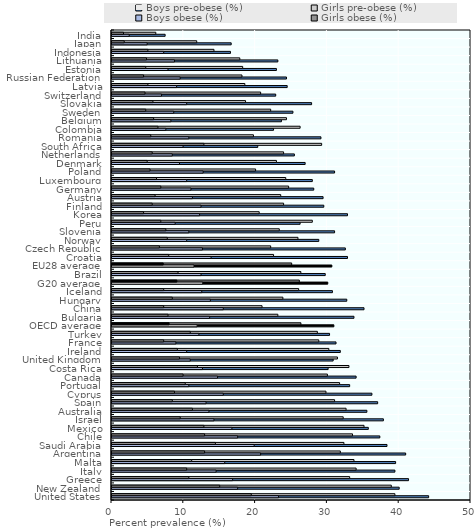
| Category | Boys pre-obese (%) | Girls pre-obese (%) |
|---|---|---|
| United States | 44.1 | 39.4 |
| New Zealand | 40 | 38.9 |
| Greece | 41.3 | 33.1 |
| Italy | 39.4 | 34 |
| Malta | 39.5 | 33.7 |
| Argentina | 40.9 | 31.8 |
| Saudi Arabia | 38.3 | 32.3 |
| Chile | 37.3 | 33.5 |
| Mexico | 35.7 | 35.1 |
| Israel | 37.8 | 32.2 |
| Australia | 35.5 | 32.6 |
| Spain | 37 | 31 |
| Cyprus | 36.2 | 29.8 |
| Portugal | 33.1 | 31.7 |
| Canada | 34 | 30 |
| Costa Rica | 30.1 | 33 |
| United Kingdom | 30.8 | 31.4 |
| Ireland | 31.8 | 30.2 |
| France | 31.2 | 28.8 |
| Turkey | 30.3 | 28.6 |
| OECD average | 30.9 | 26.308 |
| Bulgaria | 33.7 | 23.1 |
| China | 35.1 | 20.9 |
| Hungary | 32.7 | 23.8 |
| Iceland | 30.7 | 26 |
| G20 average | 30.053 | 26.089 |
| Brazil | 29.7 | 26.3 |
| EU28 average | 30.618 | 25.025 |
| Croatia | 32.8 | 22.5 |
| Czech Republic | 32.5 | 22.1 |
| Norway | 28.8 | 25.9 |
| Slovenia | 31 | 23.3 |
| Peru | 26.2 | 27.9 |
| Korea | 32.8 | 20.5 |
| Finland | 29.5 | 23.9 |
| Austria | 29.4 | 23.5 |
| Germany | 28.1 | 24.6 |
| Luxembourg | 27.9 | 24.2 |
| Poland | 31 | 20 |
| Denmark | 26.9 | 22.9 |
| Netherlands | 25.4 | 23.9 |
| South Africa | 20.3 | 29.2 |
| Romania | 29.1 | 19.7 |
| Colombia | 22.5 | 26.2 |
| Belgium | 23.6 | 24.3 |
| Sweden | 25.2 | 22.1 |
| Slovakia | 27.8 | 18.6 |
| Switzerland | 22.8 | 20.7 |
| Latvia | 24.4 | 18.5 |
| Russian Federation | 24.3 | 18.1 |
| Estonia | 22.9 | 18.2 |
| Lithuania | 23.1 | 17.8 |
| Indonesia | 16.5 | 14.2 |
| Japan | 16.6 | 11.8 |
| India | 7.4 | 6.1 |